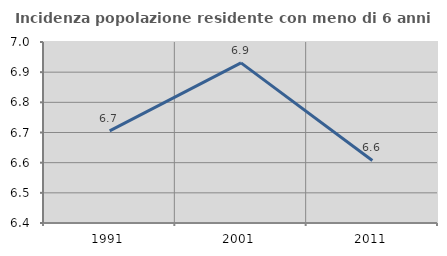
| Category | Incidenza popolazione residente con meno di 6 anni |
|---|---|
| 1991.0 | 6.705 |
| 2001.0 | 6.931 |
| 2011.0 | 6.607 |